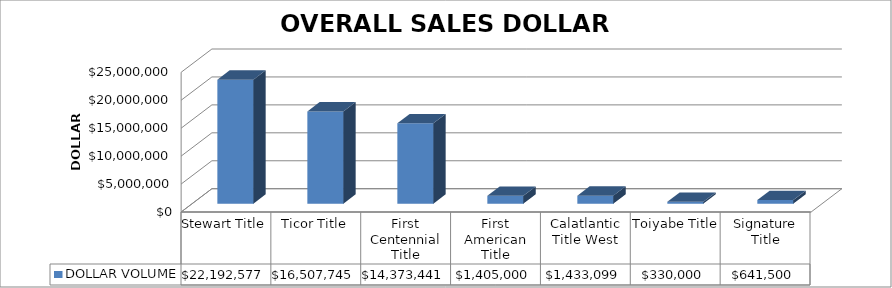
| Category | DOLLAR VOLUME |
|---|---|
| Stewart Title | 22192577 |
| Ticor Title | 16507745 |
| First Centennial Title | 14373441 |
| First American Title | 1405000 |
| Calatlantic Title West | 1433099 |
| Toiyabe Title | 330000 |
| Signature Title | 641500 |